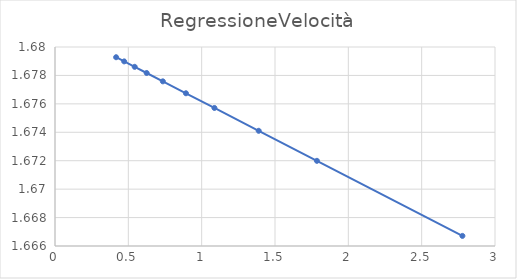
| Category | Series 0 |
|---|---|
| 2.777777777777778 | 1.667 |
| 1.7857142857142858 | 1.672 |
| 1.388888888888889 | 1.674 |
| 1.0869565217391306 | 1.676 |
| 0.8928571428571429 | 1.677 |
| 0.7352941176470588 | 1.678 |
| 0.625 | 1.678 |
| 0.5434782608695653 | 1.679 |
| 0.47169811320754723 | 1.679 |
| 0.4166666666666667 | 1.679 |